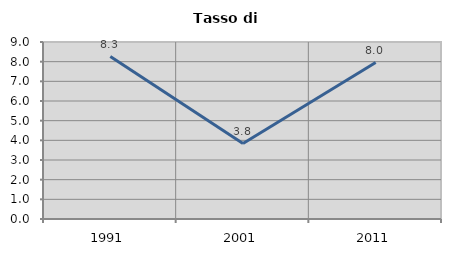
| Category | Tasso di disoccupazione   |
|---|---|
| 1991.0 | 8.263 |
| 2001.0 | 3.837 |
| 2011.0 | 7.955 |